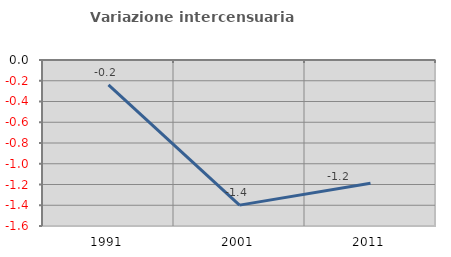
| Category | Variazione intercensuaria annua |
|---|---|
| 1991.0 | -0.239 |
| 2001.0 | -1.399 |
| 2011.0 | -1.188 |